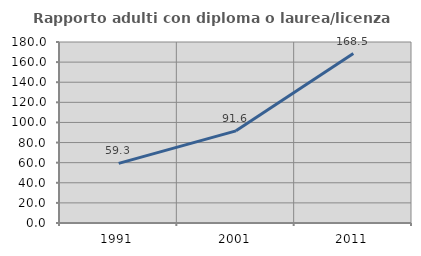
| Category | Rapporto adulti con diploma o laurea/licenza media  |
|---|---|
| 1991.0 | 59.332 |
| 2001.0 | 91.646 |
| 2011.0 | 168.501 |